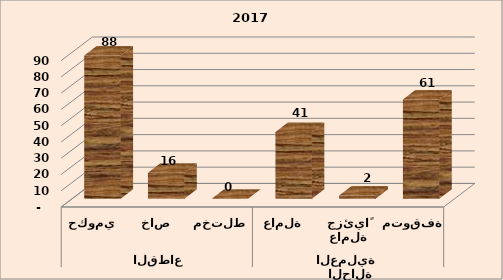
| Category | Series 0 |
|---|---|
| 0 | 88 |
| 1 | 16 |
| 2 | 0 |
| 3 | 41 |
| 4 | 2 |
| 5 | 61 |